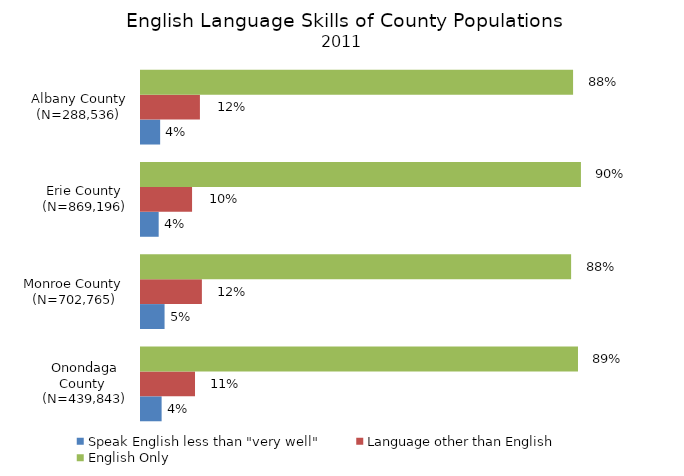
| Category | Speak English less than "very well" | Language other than English | English Only |
|---|---|---|---|
| Onondaga County  (N=439,843) | 0.042 | 0.11 | 0.89 |
| Monroe County  (N=702,765) | 0.048 | 0.124 | 0.876 |
| Erie County (N=869,196) | 0.036 | 0.104 | 0.896 |
| Albany County (N=288,536) | 0.039 | 0.12 | 0.88 |